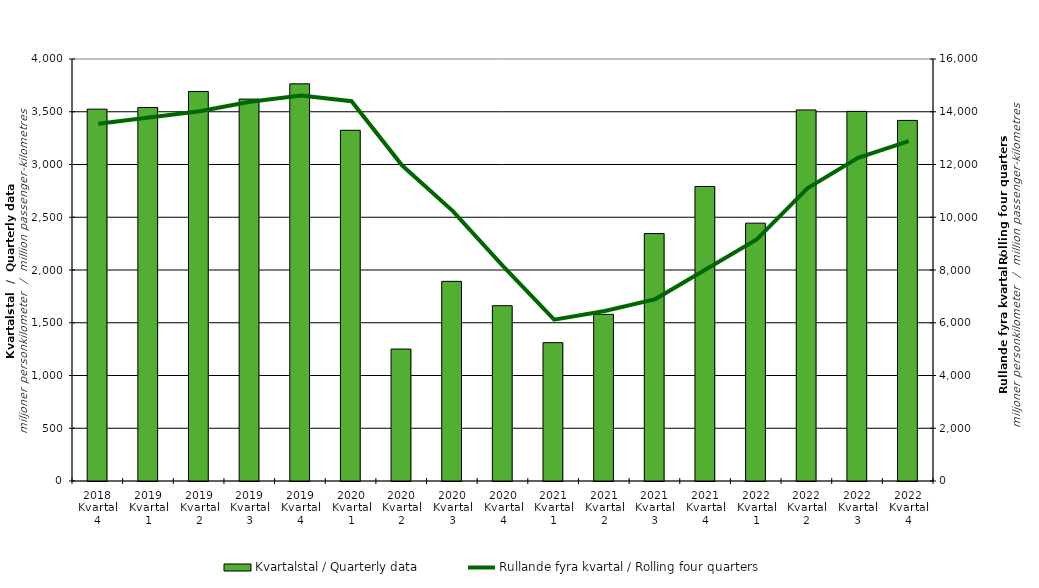
| Category | Kvartalstal / Quarterly data |
|---|---|
| 2018 Kvartal 4 | 3524.594 |
| 2019 Kvartal 1 | 3540.48 |
| 2019 Kvartal 2 | 3692.248 |
| 2019 Kvartal 3 | 3619.721 |
| 2019 Kvartal 4 | 3764.759 |
| 2020 Kvartal 1 | 3324.383 |
| 2020 Kvartal 2 | 1250.488 |
| 2020 Kvartal 3 | 1892.351 |
| 2020 Kvartal 4 | 1661.523 |
| 2021 Kvartal 1 | 1311.197 |
| 2021 Kvartal 2 | 1579.614 |
| 2021 Kvartal 3 | 2345.169 |
| 2021 Kvartal 4 | 2791.509 |
| 2022 Kvartal 1 | 2444.152 |
| 2022 Kvartal 2 | 3517.085 |
| 2022 Kvartal 3 | 3503.486 |
| 2022 Kvartal 4 | 3418.044 |